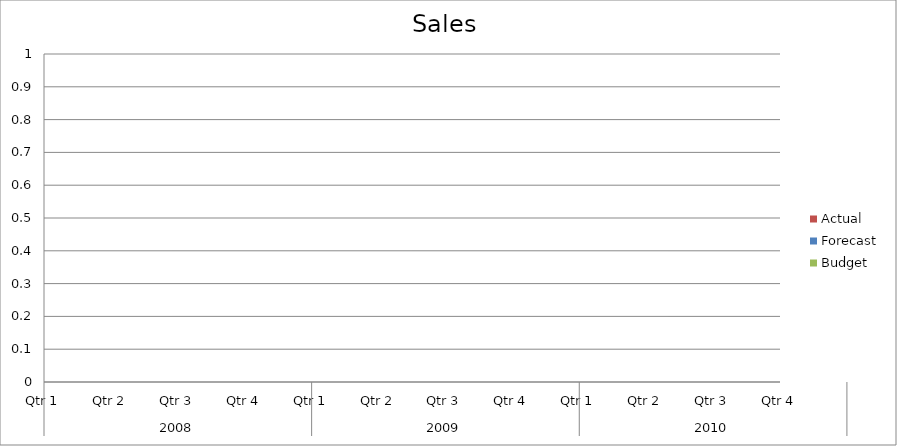
| Category | Budget | Forecast | Actual |
|---|---|---|---|
| 0 | 3270 | 3220 | 940 |
| 1 | 810 | 840 | 3100 |
| 2 | 1420 | 1780 | 1420 |
| 3 | 1430 | 2470 | 910 |
| 4 | 2000 | 2480 | 1730 |
| 5 | 3450 | 2500 | 550 |
| 6 | 3140 | 1460 | 2640 |
| 7 | 2680 | 540 | 2940 |
| 8 | 1920 | 1520 | 1320 |
| 9 | 700 | 2410 | 1490 |
| 10 | 1090 | 1150 | 3200 |
| 11 | 3090 | 3000 | 2820 |